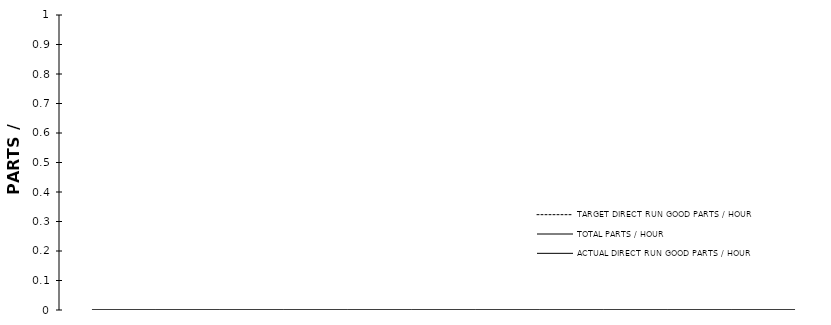
| Category | TARGET DIRECT RUN GOOD PARTS / HOUR | TOTAL PARTS / HOUR | ACTUAL DIRECT RUN GOOD PARTS / HOUR |
|---|---|---|---|
| 0 |  | 0 | 0 |
| 1 |  | 0 | 0 |
| 2 |  | 0 | 0 |
| 3 |  | 0 | 0 |
| 4 |  | 0 | 0 |
| 5 |  | 0 | 0 |
| 6 |  | 0 | 0 |
| 7 |  | 0 | 0 |
| 8 |  | 0 | 0 |
| 9 |  | 0 | 0 |
| 10 |  | 0 | 0 |
| 11 |  | 0 | 0 |